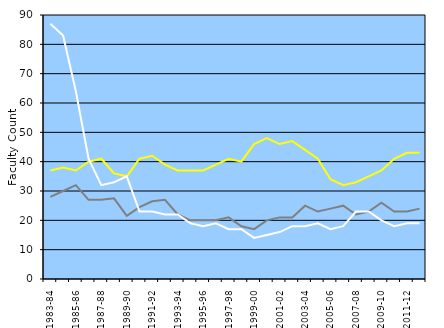
| Category | Simon Graduate School of Business | Warner Graduate School of Education | School of Nursing |
|---|---|---|---|
| 1983-84 | 37 | 28 | 87 |
| 1984-85 | 38 | 30 | 83 |
| 1985-86 | 37 | 32 | 64 |
| 1986-87 | 40 | 27 | 41 |
| 1987-88 | 41 | 27 | 32 |
| 1988-89 | 36 | 27.5 | 33 |
| 1989-90 | 35 | 21.5 | 35 |
| 1990-91 | 41 | 24.5 | 23 |
| 1991-92 | 42 | 26.5 | 23 |
| 1992-93 | 39 | 27 | 22 |
| 1993-94 | 37 | 22 | 22 |
| 1994-95 | 37 | 20 | 19 |
| 1995-96 | 37 | 20 | 18 |
| 1996-97 | 39 | 20 | 19 |
| 1997-98 | 41 | 21 | 17 |
| 1998-99 | 40 | 18 | 17 |
| 1999-00 | 46 | 17 | 14 |
| 2000-01 | 48 | 20 | 15 |
| 2001-02 | 46 | 21 | 16 |
| 2002-03 | 47 | 21 | 18 |
| 2003-04 | 44 | 25 | 18 |
| 2004-05 | 41 | 23 | 19 |
| 2005-06 | 34 | 24 | 17 |
| 2006-07 | 32 | 25 | 18 |
| 2007-08 | 33 | 22 | 23 |
| 2008-09 | 35 | 23 | 23 |
| 2009-10 | 37 | 26 | 20 |
| 2010-11 | 41 | 23 | 18 |
| 2011-12 | 43 | 23 | 19 |
| 2012-13 | 43 | 24 | 19 |